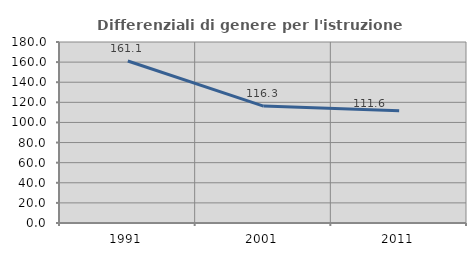
| Category | Differenziali di genere per l'istruzione superiore |
|---|---|
| 1991.0 | 161.099 |
| 2001.0 | 116.282 |
| 2011.0 | 111.582 |